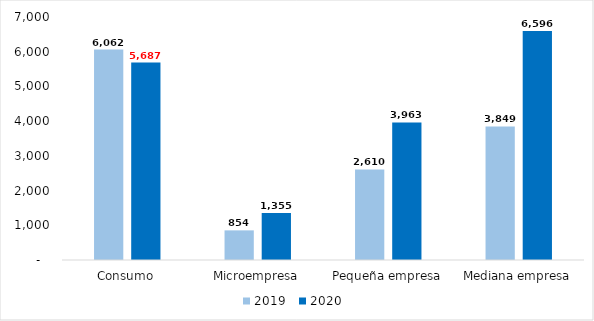
| Category | 2019 | 2020 |
|---|---|---|
| Consumo | 6062.274 | 5686.773 |
| Microempresa | 853.788 | 1354.91 |
| Pequeña empresa | 2609.825 | 3963.147 |
| Mediana empresa | 3848.858 | 6595.605 |